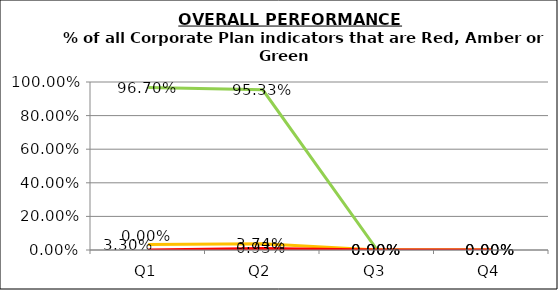
| Category | Green | Amber | Red |
|---|---|---|---|
| Q1 | 0.967 | 0.033 | 0 |
| Q2 | 0.953 | 0.037 | 0.009 |
| Q3 | 0 | 0 | 0 |
| Q4 | 0 | 0 | 0 |